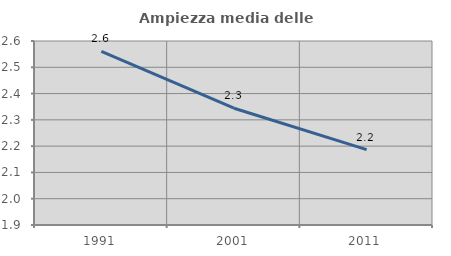
| Category | Ampiezza media delle famiglie |
|---|---|
| 1991.0 | 2.561 |
| 2001.0 | 2.344 |
| 2011.0 | 2.187 |